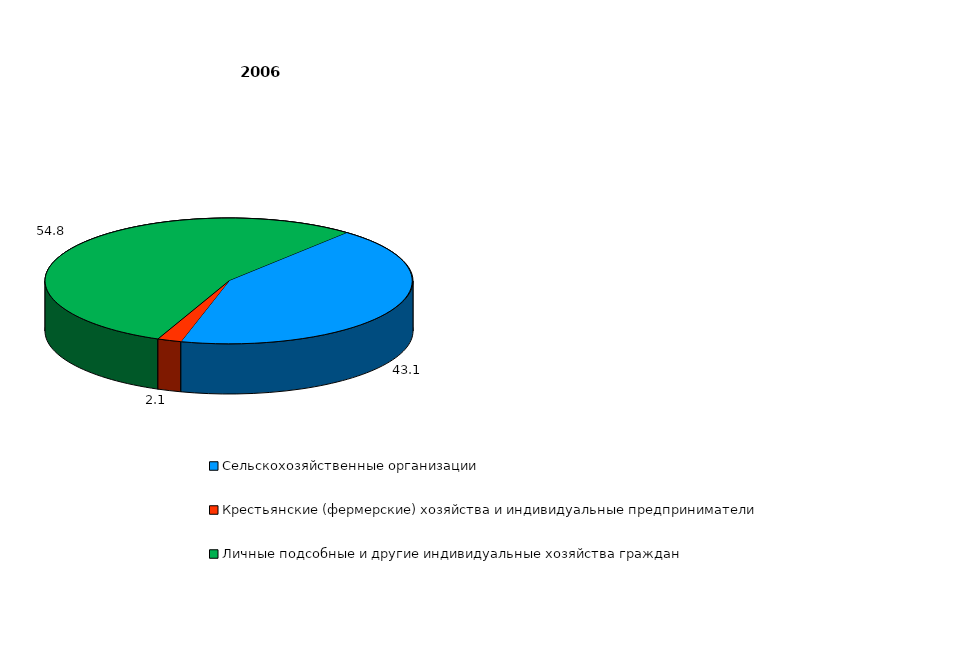
| Category | Series 0 |
|---|---|
| Сельскохозяйственные организации  | 43.1 |
| Крестьянские (фермерские) хозяйства и индивидуальные предприниматели  | 2.1 |
| Личные подсобные и другие индивидуальные хозяйства граждан  | 54.8 |